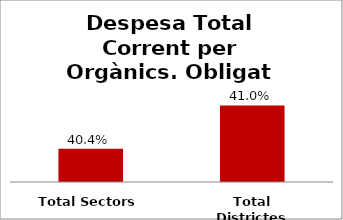
| Category | Series 0 |
|---|---|
| Total Sectors | 0.404 |
| Total Districtes | 0.41 |